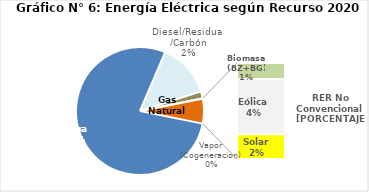
| Category | Series 0 |
|---|---|
| Agua | 2838.426 |
| Gas Natural | 493.313 |
| Diesel/Residual/Carbón | 64.555 |
| Vapor (Cogeneracion) | 0.215 |
| Biomasa (BZ+BG) | 39.044 |
| Eólica | 131.245 |
| Solar | 58.929 |